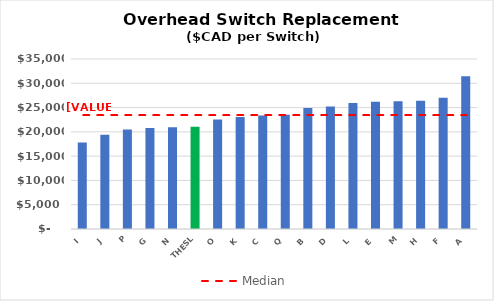
| Category | Series 0 |
|---|---|
| I | 17833.692 |
| J | 19407.085 |
| P | 20461.498 |
| G | 20804.922 |
| N | 20933.428 |
| THESL | 21062 |
| O | 22569.839 |
| K | 23037.898 |
| C | 23378.262 |
| Q | 23523.948 |
| B | 24892.225 |
| D | 25206.895 |
| L | 25948.067 |
| E | 26174.607 |
| M | 26281.1 |
| H | 26379.935 |
| F | 27009.575 |
| A | 31459.756 |